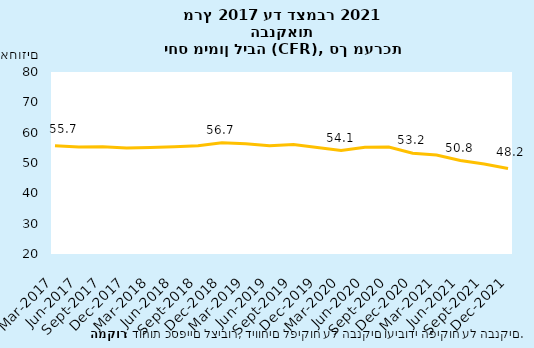
| Category | CFR |
|---|---|
| 2017-03-31 | 55.704 |
| 2017-06-30 | 55.256 |
| 2017-09-30 | 55.381 |
| 2017-12-31 | 54.931 |
| 2018-03-31 | 55.117 |
| 2018-06-30 | 55.39 |
| 2018-09-30 | 55.658 |
| 2018-12-31 | 56.651 |
| 2019-03-31 | 56.356 |
| 2019-06-30 | 55.664 |
| 2019-09-30 | 56.061 |
| 2019-12-31 | 55.091 |
| 2020-03-31 | 54.104 |
| 2020-06-30 | 55.191 |
| 2020-09-30 | 55.257 |
| 2020-12-31 | 53.246 |
| 2021-03-31 | 52.655 |
| 2021-06-30 | 50.824 |
| 2021-09-30 | 49.683 |
| 2021-12-31 | 48.164 |